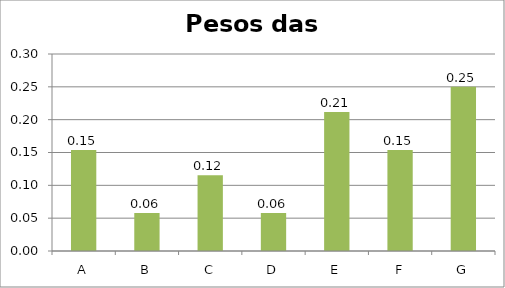
| Category | Pesos |
|---|---|
| A | 0.154 |
| B | 0.058 |
| C | 0.115 |
| D | 0.058 |
| E | 0.212 |
| F | 0.154 |
| G | 0.25 |